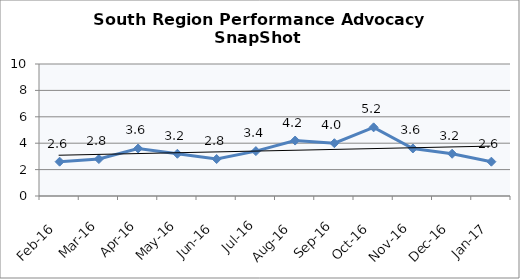
| Category | South Region |
|---|---|
| Feb-16 | 2.6 |
| Mar-16 | 2.8 |
| Apr-16 | 3.6 |
| May-16 | 3.2 |
| Jun-16 | 2.8 |
| Jul-16 | 3.4 |
| Aug-16 | 4.2 |
| Sep-16 | 4 |
| Oct-16 | 5.2 |
| Nov-16 | 3.6 |
| Dec-16 | 3.2 |
| Jan-17 | 2.6 |